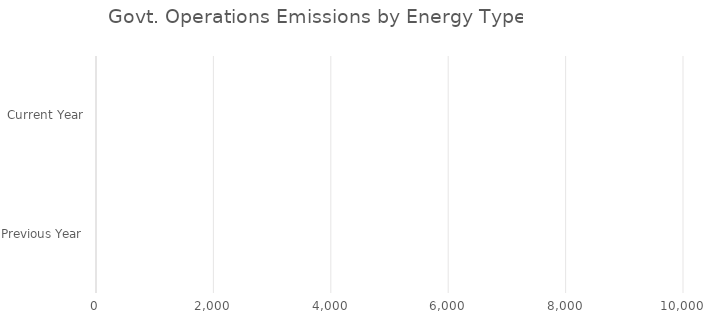
| Category | Electricity | Natural Gas | Liquid Fuel | Waste |
|---|---|---|---|---|
| Previous Year | 0 | 0 | 0 | 0 |
| Current Year | 0 | 0 | 0 | 0 |